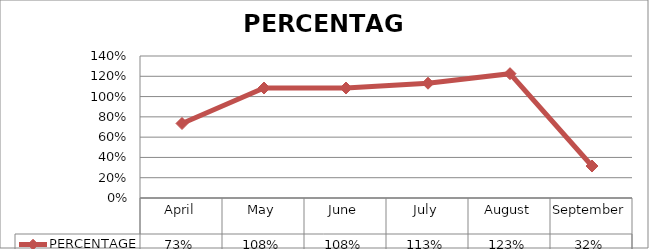
| Category | PERCENTAGE |
|---|---|
| April | 0.735 |
| May | 1.084 |
| June | 1.084 |
| July | 1.132 |
| August | 1.226 |
| September | 0.315 |